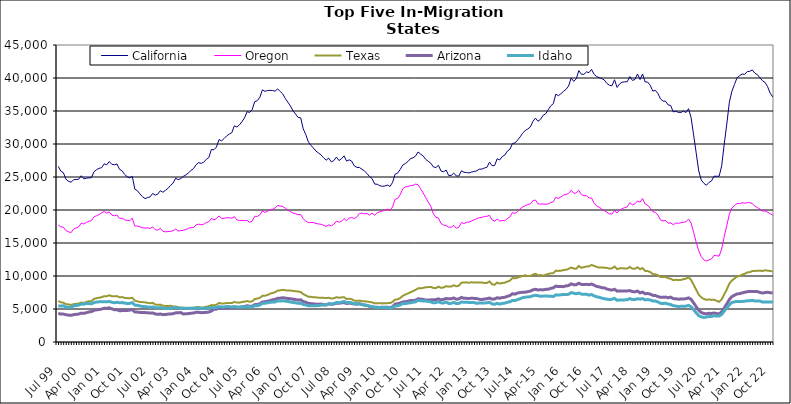
| Category | California | Oregon | Texas | Arizona | Idaho |
|---|---|---|---|---|---|
| Jul 99 | 26605 | 17749 | 6209 | 4339 | 5471 |
| Aug 99 | 25882 | 17447 | 6022 | 4228 | 5444 |
| Sep 99 | 25644 | 17401 | 5941 | 4237 | 5488 |
| Oct 99 | 24669 | 16875 | 5751 | 4134 | 5279 |
| Nov 99 | 24353 | 16701 | 5680 | 4073 | 5260 |
| Dec 99 | 24218 | 16570 | 5619 | 4042 | 5269 |
| Jan 00 | 24574 | 17109 | 5736 | 4142 | 5485 |
| Feb 00 | 24620 | 17295 | 5789 | 4192 | 5530 |
| Mar 00 | 24655 | 17436 | 5826 | 4226 | 5590 |
| Apr 00 | 25195 | 18009 | 5980 | 4375 | 5748 |
| May 00 | 24730 | 17875 | 5897 | 4337 | 5729 |
| Jun 00 | 24825 | 18113 | 6070 | 4444 | 5853 |
| Jul 00 | 24857 | 18294 | 6163 | 4555 | 5824 |
| Aug 00 | 24913 | 18376 | 6199 | 4603 | 5788 |
| Sep 00 | 25792 | 18971 | 6529 | 4804 | 5976 |
| Oct 00 | 26106 | 19135 | 6643 | 4870 | 6058 |
| Nov 00 | 26315 | 19306 | 6705 | 4926 | 6085 |
| Dec 00 | 26415 | 19570 | 6793 | 4991 | 6096 |
| Jan 01 | 26995 | 19781 | 6942 | 5122 | 6119 |
| Feb 01 | 26851 | 19519 | 6948 | 5089 | 6090 |
| Mar 01 | 27352 | 19720 | 7080 | 5180 | 6143 |
| Apr 01 | 26918 | 19221 | 6943 | 5020 | 6020 |
| May 01 | 26848 | 19126 | 6924 | 4899 | 5950 |
| Jun 01 | 26974 | 19241 | 6959 | 4895 | 6019 |
| Jul 01 | 26172 | 18725 | 6778 | 4737 | 5951 |
| Aug 01 | 25943 | 18736 | 6810 | 4757 | 5973 |
| Sep 01 | 25399 | 18514 | 6688 | 4753 | 5895 |
| Oct 01 | 25050 | 18415 | 6650 | 4780 | 5833 |
| Nov 01 | 24873 | 18381 | 6631 | 4826 | 5850 |
| Dec 01 | 25099 | 18765 | 6708 | 4898 | 5969 |
| Jan 02 | 23158 | 17561 | 6261 | 4560 | 5595 |
| Feb 02 | 22926 | 17573 | 6162 | 4531 | 5560 |
| Mar 02 | 22433 | 17452 | 6052 | 4481 | 5458 |
| Apr 02 | 22012 | 17314 | 6046 | 4458 | 5380 |
| May 02 | 21733 | 17267 | 6007 | 4452 | 5358 |
| Jun 02 | 21876 | 17298 | 5933 | 4444 | 5315 |
| Jul 02 | 21997 | 17209 | 5873 | 4383 | 5243 |
| Aug 02 | 22507 | 17436 | 5929 | 4407 | 5315 |
| Sep 02 | 22244 | 17010 | 5672 | 4248 | 5192 |
| Oct 02 | 22406 | 16952 | 5625 | 4191 | 5167 |
| Nov 02 | 22922 | 17223 | 5663 | 4242 | 5221 |
| Dec 02 | 22693 | 16770 | 5499 | 4142 | 5120 |
| Jan 03 | 22964 | 16694 | 5463 | 4166 | 5089 |
| Feb 03 | 23276 | 16727 | 5461 | 4226 | 5077 |
| Mar 03 | 23736 | 16766 | 5486 | 4251 | 5145 |
| Apr 03 | 24079 | 16859 | 5389 | 4289 | 5145 |
| May 03 | 24821 | 17117 | 5378 | 4415 | 5254 |
| Jun 03 | 24592 | 16812 | 5273 | 4426 | 5135 |
| Jul 03 | 24754 | 16875 | 5226 | 4466 | 5124 |
| Aug 03 | 25092 | 16922 | 5181 | 4244 | 5100 |
| Sep 03 | 25316 | 17036 | 5181 | 4279 | 5086 |
| Oct 03 | 25622 | 17228 | 5139 | 4301 | 5110 |
| Nov 03 | 25984 | 17335 | 5175 | 4362 | 5091 |
| Dec 03 | 26269 | 17350 | 5189 | 4396 | 5113 |
| Jan 04 | 26852 | 17734 | 5255 | 4492 | 5152 |
| Feb 04 | 27184 | 17860 | 5301 | 4502 | 5183 |
| Mar 04 | 27062 | 17757 | 5227 | 4443 | 5056 |
| Apr 04 | 27238 | 17840 | 5227 | 4461 | 5104 |
| May 04 | 27671 | 18113 | 5345 | 4493 | 5095 |
| Jun 04 | 27949 | 18201 | 5416 | 4532 | 5103 |
| Jul 04 | 29172 | 18727 | 5597 | 4697 | 5231 |
| Aug 04 | 29122 | 18529 | 5561 | 4945 | 5197 |
| Sep 04 | 29542 | 18678 | 5656 | 4976 | 5237 |
| Oct 04 | 30674 | 19108 | 5922 | 5188 | 5363 |
| Nov 04 | 30472 | 18716 | 5823 | 5106 | 5321 |
| Dec 04 | 30831 | 18755 | 5838 | 5135 | 5312 |
| Jan 05 | 31224 | 18823 | 5906 | 5155 | 5374 |
| Feb 05 | 31495 | 18842 | 5898 | 5168 | 5357 |
| Mar 05 | 31714 | 18738 | 5894 | 5212 | 5313 |
| Apr 05 | 32750 | 18998 | 6060 | 5340 | 5350 |
| May 05 | 32575 | 18504 | 5989 | 5269 | 5276 |
| Jun 05 | 32898 | 18414 | 5954 | 5252 | 5271 |
| Jul 05 | 33384 | 18395 | 6062 | 5322 | 5322 |
| Aug 05 | 33964 | 18381 | 6113 | 5375 | 5316 |
| Sep 05 | 34897 | 18426 | 6206 | 5493 | 5362 |
| Oct 05 | 34780 | 18132 | 6100 | 5408 | 5308 |
| Nov 05 | 35223 | 18332 | 6162 | 5434 | 5314 |
| Dec 05 | 36415 | 19047 | 6508 | 5658 | 5487 |
| Jan 06 | 36567 | 19032 | 6576 | 5688 | 5480 |
| Feb 06 | 37074 | 19257 | 6692 | 5792 | 5616 |
| Mar 06 | 38207 | 19845 | 6993 | 6052 | 5850 |
| Apr 06 | 37976 | 19637 | 7024 | 6101 | 5864 |
| May 06 | 38099 | 19781 | 7114 | 6178 | 5943 |
| Jun 06 | 38141 | 20061 | 7331 | 6276 | 6018 |
| Jul 06 | 38097 | 20111 | 7431 | 6399 | 6046 |
| Aug 06 | 38021 | 20333 | 7542 | 6450 | 6064 |
| Sep 06 | 38349 | 20686 | 7798 | 6627 | 6232 |
| Oct 06 | 37947 | 20591 | 7825 | 6647 | 6216 |
| Nov 06 | 37565 | 20526 | 7907 | 6707 | 6244 |
| Dec 06 | 36884 | 20272 | 7840 | 6648 | 6192 |
| Jan 07 | 36321 | 19984 | 7789 | 6597 | 6151 |
| Feb 07 | 35752 | 19752 | 7799 | 6554 | 6048 |
| Mar 07 | 35025 | 19547 | 7737 | 6487 | 5989 |
| Apr 07 | 34534 | 19412 | 7685 | 6430 | 5937 |
| May 07 | 34022 | 19296 | 7654 | 6353 | 5858 |
| Jun 07 | 33974 | 19318 | 7577 | 6390 | 5886 |
| Jul 07 | 32298 | 18677 | 7250 | 6117 | 5682 |
| Aug 07 | 31436 | 18322 | 7070 | 6034 | 5617 |
| Sep 07 | 30331 | 18087 | 6853 | 5847 | 5500 |
| Oct 07 | 29813 | 18108 | 6839 | 5821 | 5489 |
| Nov 07 | 29384 | 18105 | 6777 | 5769 | 5481 |
| Dec 07 | 28923 | 17949 | 6760 | 5733 | 5499 |
| Jan 08 | 28627 | 17890 | 6721 | 5732 | 5521 |
| Feb 08 | 28328 | 17834 | 6719 | 5749 | 5579 |
| Mar 08 | 27911 | 17680 | 6690 | 5650 | 5614 |
| Apr 08 | 27543 | 17512 | 6656 | 5612 | 5635 |
| May 08 | 27856 | 17754 | 6705 | 5774 | 5798 |
| Jun 08 | 27287 | 17589 | 6593 | 5717 | 5745 |
| Jul 08 | 27495 | 17834 | 6623 | 5761 | 5807 |
| Aug 08 | 28018 | 18309 | 6789 | 5867 | 5982 |
| Sep-08 | 27491 | 18164 | 6708 | 5864 | 5954 |
| Oct 08 | 27771 | 18291 | 6755 | 5942 | 6032 |
| Nov 08 | 28206 | 18706 | 6787 | 5970 | 6150 |
| Dec 08 | 27408 | 18353 | 6505 | 5832 | 5975 |
| Jan 09 | 27601 | 18778 | 6569 | 5890 | 5995 |
| Feb 09 | 27394 | 18863 | 6483 | 5845 | 5936 |
| Mar 09 | 26690 | 18694 | 6273 | 5751 | 5806 |
| Apr 09 | 26461 | 18943 | 6222 | 5735 | 5777 |
| May 09 | 26435 | 19470 | 6272 | 5819 | 5767 |
| Jun 09 | 26187 | 19522 | 6199 | 5700 | 5649 |
| Jul 09 | 25906 | 19408 | 6171 | 5603 | 5617 |
| Aug 09 | 25525 | 19469 | 6128 | 5533 | 5540 |
| Sep 09 | 25050 | 19249 | 6059 | 5405 | 5437 |
| Oct 09 | 24741 | 19529 | 6004 | 5349 | 5369 |
| Nov 09 | 23928 | 19187 | 5854 | 5271 | 5248 |
| Dec 09 | 23899 | 19607 | 5886 | 5261 | 5195 |
| Jan 10 | 23676 | 19703 | 5881 | 5232 | 5234 |
| Feb 10 | 23592 | 19845 | 5850 | 5272 | 5236 |
| Mar 10 | 23634 | 19946 | 5864 | 5278 | 5219 |
| Apr 10 | 23774 | 20134 | 5889 | 5257 | 5201 |
| May 10 | 23567 | 19966 | 5897 | 5172 | 5105 |
| Jun 10 | 24166 | 20464 | 6087 | 5356 | 5237 |
| Jul 10 | 25410 | 21627 | 6417 | 5742 | 5452 |
| Aug 10 | 25586 | 21744 | 6465 | 5797 | 5491 |
| Sep 10 | 26150 | 22314 | 6667 | 5907 | 5609 |
| Oct 10 | 26807 | 23219 | 6986 | 6070 | 5831 |
| Nov 10 | 27033 | 23520 | 7179 | 6100 | 5810 |
| Dec 10 | 27332 | 23551 | 7361 | 6182 | 5898 |
| Jan 11 | 27769 | 23697 | 7525 | 6276 | 5938 |
| Feb 11 | 27898 | 23718 | 7708 | 6267 | 6016 |
| Mar 11 | 28155 | 23921 | 7890 | 6330 | 6081 |
| Apr 11 | 28790 | 23847 | 8146 | 6544 | 6305 |
| May 11 | 28471 | 23215 | 8131 | 6502 | 6248 |
| Jun 11 | 28191 | 22580 | 8199 | 6445 | 6217 |
| Jul 11 | 27678 | 21867 | 8291 | 6368 | 6202 |
| Aug 11 | 27372 | 21203 | 8321 | 6356 | 6146 |
| Sep 11 | 27082 | 20570 | 8341 | 6387 | 6075 |
| Oct 11 | 26528 | 19442 | 8191 | 6402 | 5932 |
| Nov 11 | 26440 | 18872 | 8176 | 6426 | 5968 |
| Dec 11 | 26770 | 18784 | 8401 | 6533 | 6106 |
| Jan 12 | 25901 | 17963 | 8202 | 6390 | 5933 |
| Feb 12 | 25796 | 17718 | 8266 | 6456 | 5900 |
| Mar 12 | 26042 | 17647 | 8456 | 6600 | 6054 |
| Apr 12 | 25239 | 17386 | 8388 | 6534 | 5838 |
| May 12 | 25238 | 17407 | 8401 | 6558 | 5854 |
| Jun 12 | 25593 | 17673 | 8594 | 6669 | 6009 |
| Jul 12 | 25155 | 17237 | 8432 | 6474 | 5817 |
| Aug 12 | 25146 | 17391 | 8536 | 6539 | 5842 |
| Sep 12 | 25942 | 18102 | 8989 | 6759 | 6061 |
| Oct 12 | 25718 | 17953 | 9012 | 6618 | 6027 |
| Nov 12 | 25677 | 18134 | 9032 | 6611 | 6009 |
| Dec 12 | 25619 | 18166 | 8981 | 6601 | 5999 |
| Jan 13 | 25757 | 18344 | 9051 | 6627 | 5989 |
| Feb-13 | 25830 | 18512 | 9001 | 6606 | 5968 |
| Mar-13 | 25940 | 18689 | 9021 | 6577 | 5853 |
| Apr 13 | 26187 | 18844 | 9013 | 6478 | 5925 |
| May 13 | 26192 | 18884 | 9003 | 6431 | 5924 |
| Jun-13 | 26362 | 19013 | 8948 | 6508 | 5896 |
| Jul 13 | 26467 | 19037 | 8958 | 6559 | 5948 |
| Aug 13 | 27253 | 19198 | 9174 | 6655 | 6020 |
| Sep 13 | 26711 | 18501 | 8747 | 6489 | 5775 |
| Oct 13 | 26733 | 18301 | 8681 | 6511 | 5711 |
| Nov 13 | 27767 | 18620 | 8989 | 6709 | 5860 |
| Dec 13 | 27583 | 18320 | 8863 | 6637 | 5740 |
| Jan 14 | 28107 | 18409 | 8939 | 6735 | 5843 |
| Feb-14 | 28313 | 18383 | 8989 | 6779 | 5893 |
| Mar 14 | 28934 | 18696 | 9160 | 6918 | 6015 |
| Apr 14 | 29192 | 18946 | 9291 | 7036 | 6099 |
| May 14 | 30069 | 19603 | 9701 | 7314 | 6304 |
| Jun 14 | 30163 | 19487 | 9641 | 7252 | 6293 |
| Jul-14 | 30587 | 19754 | 9752 | 7415 | 6427 |
| Aug-14 | 31074 | 20201 | 9882 | 7499 | 6557 |
| Sep 14 | 31656 | 20459 | 9997 | 7536 | 6719 |
| Oct 14 | 32037 | 20663 | 10109 | 7555 | 6786 |
| Nov 14 | 32278 | 20825 | 9992 | 7628 | 6831 |
| Dec 14 | 32578 | 20918 | 10006 | 7705 | 6860 |
| Jan 15 | 33414 | 21396 | 10213 | 7906 | 7000 |
| Feb 15 | 33922 | 21518 | 10337 | 7982 | 7083 |
| Mar 15 | 33447 | 20942 | 10122 | 7891 | 7006 |
| Apr-15 | 33731 | 20893 | 10138 | 7906 | 6931 |
| May 15 | 34343 | 20902 | 10053 | 7895 | 6952 |
| Jun-15 | 34572 | 20870 | 10192 | 7973 | 6966 |
| Jul 15 | 35185 | 20916 | 10303 | 8000 | 6949 |
| Aug 15 | 35780 | 21115 | 10399 | 8126 | 6938 |
| Sep 15 | 36109 | 21246 | 10428 | 8207 | 6896 |
| Oct 15 | 37555 | 21908 | 10813 | 8477 | 7140 |
| Nov 15 | 37319 | 21750 | 10763 | 8390 | 7112 |
| Dec 15 | 37624 | 21990 | 10807 | 8395 | 7149 |
| Jan 16 | 37978 | 22248 | 10892 | 8388 | 7201 |
| Feb 16 | 38285 | 22369 | 10951 | 8508 | 7192 |
| Mar 16 | 38792 | 22506 | 11075 | 8547 | 7226 |
| Apr 16 | 39994 | 22999 | 11286 | 8815 | 7487 |
| May 16 | 39488 | 22548 | 11132 | 8673 | 7382 |
| Jun 16 | 39864 | 22556 | 11100 | 8682 | 7315 |
| Jul 16 | 41123 | 22989 | 11516 | 8903 | 7420 |
| Aug 16 | 40573 | 22333 | 11251 | 8731 | 7261 |
| Sep 16 | 40560 | 22162 | 11340 | 8692 | 7216 |
| Oct 16 | 40923 | 22172 | 11456 | 8742 | 7233 |
| Nov 16 | 40817 | 21818 | 11459 | 8685 | 7101 |
| Dec 16 | 41311 | 21815 | 11681 | 8783 | 7203 |
| Jan 17 | 40543 | 21029 | 11524 | 8609 | 6982 |
| Feb 17 | 40218 | 20613 | 11385 | 8416 | 6852 |
| Mar 17 | 40052 | 20425 | 11276 | 8354 | 6775 |
| Apr 17 | 39913 | 20147 | 11297 | 8218 | 6653 |
| May 17 | 39695 | 19910 | 11265 | 8196 | 6552 |
| Jun 17 | 39177 | 19650 | 11225 | 8034 | 6500 |
| Jul 17 | 38901 | 19419 | 11115 | 7923 | 6429 |
| Aug 17 | 38827 | 19389 | 11168 | 7867 | 6479 |
| Sep 17 | 39736 | 19936 | 11426 | 7991 | 6609 |
| Oct 17 | 38576 | 19547 | 11041 | 7708 | 6315 |
| Nov 17 | 39108 | 20013 | 11158 | 7746 | 6381 |
| Dec 17 | 39359 | 20202 | 11185 | 7743 | 6366 |
| Jan 18 | 39420 | 20362 | 11118 | 7736 | 6380 |
| Feb 18 | 39440 | 20476 | 11128 | 7741 | 6407 |
| Mar 18 | 40218 | 21106 | 11362 | 7789 | 6578 |
| Apr 18 | 39637 | 20788 | 11111 | 7642 | 6423 |
| May 18 | 39777 | 20933 | 11097 | 7591 | 6430 |
| Jun 18 | 40602 | 21381 | 11317 | 7721 | 6554 |
| Jul 18 | 39767 | 21189 | 11038 | 7445 | 6489 |
| Aug 18 | 40608 | 21729 | 11200 | 7560 | 6569 |
| Sep 18 | 39395 | 20916 | 10772 | 7318 | 6383 |
| Oct 18 | 39383 | 20724 | 10740 | 7344 | 6429 |
| Nov 18 | 38891 | 20265 | 10605 | 7255 | 6365 |
| Dec 18 | 38013 | 19741 | 10292 | 7069 | 6205 |
| Jan 19 | 38130 | 19643 | 10261 | 7032 | 6203 |
| Feb 19 | 37658 | 19237 | 10132 | 6892 | 6073 |
| Mar 19 | 36831 | 18492 | 9848 | 6766 | 5863 |
| Apr 19 | 36492 | 18349 | 9839 | 6763 | 5827 |
| May 19 | 36481 | 18407 | 9867 | 6809 | 5873 |
| Jun 19 | 35925 | 17998 | 9661 | 6698 | 5761 |
| Jul 19 | 35843 | 18049 | 9598 | 6800 | 5673 |
| Aug 19 | 34870 | 17785 | 9361 | 6577 | 5512 |
| Sep 19 | 34945 | 18038 | 9428 | 6547 | 5437 |
| Oct 19 | 34802 | 17977 | 9385 | 6483 | 5390 |
| Nov 19 | 34775 | 18072 | 9403 | 6511 | 5401 |
| Dec 19 | 34976 | 18140 | 9518 | 6521 | 5419 |
| Jan 20 | 34774 | 18209 | 9594 | 6561 | 5434 |
| Feb 20 | 35352 | 18632 | 9804 | 6682 | 5543 |
| Mar 20 | 34013 | 18041 | 9411 | 6464 | 5330 |
| Apr 20 | 31385 | 16629 | 8666 | 5922 | 4906 |
| May 20 | 28657 | 15123 | 7927 | 5355 | 4419 |
| Jun 20 | 25915 | 13817 | 7164 | 4815 | 3992 |
| Jul 20 | 24545 | 12926 | 6776 | 4457 | 3810 |
| Aug 20 | 24048 | 12443 | 6521 | 4326 | 3720 |
| Sep 20 | 23756 | 12258 | 6386 | 4266 | 3784 |
| Oct 20 | 24166 | 12429 | 6452 | 4347 | 3861 |
| Nov 20 | 24404 | 12597 | 6386 | 4324 | 3883 |
| Dec 20 | 25120 | 13122 | 6420 | 4394 | 3974 |
| Jan 21 | 25111 | 13080 | 6236 | 4304 | 3924 |
| Feb 21 | 25114 | 13015 | 6094 | 4260 | 3930 |
| Mar 21 | 26701 | 14096 | 6455 | 4567 | 4185 |
| Apr 21 | 29998 | 15978 | 7222 | 5164 | 4697 |
| May 21 | 33020 | 17641 | 7969 | 5748 | 5148 |
| Jun 21 | 36320 | 19369 | 8840 | 6450 | 5628 |
| Jul 21 | 37989 | 20320 | 9306 | 6877 | 5984 |
| Aug 21 | 39007 | 20657 | 9615 | 7094 | 6084 |
| Sep 21 | 40023 | 20974 | 9914 | 7277 | 6151 |
| Oct 21 | 40348 | 20966 | 10003 | 7327 | 6140 |
| Nov 21 | 40599 | 21096 | 10203 | 7437 | 6136 |
| Dec 21 | 40548 | 21032 | 10328 | 7532 | 6183 |
| Jan 22 | 40967 | 21106 | 10535 | 7618 | 6237 |
| Feb 22 | 41019 | 21125 | 10579 | 7673 | 6236 |
| Mar 22 | 41220 | 20949 | 10751 | 7660 | 6310 |
| Apr 22 | 40730 | 20602 | 10772 | 7661 | 6221 |
| May 22 | 40504 | 20370 | 10792 | 7636 | 6210 |
| Jun 22 | 40013 | 20127 | 10802 | 7504 | 6199 |
| Jul 22 | 39582 | 19846 | 10761 | 7419 | 6050 |
| Aug 22 | 39321 | 19865 | 10868 | 7487 | 6071 |
| Sep 22 | 38685 | 19666 | 10811 | 7536 | 6074 |
| Oct 22 | 37700 | 19450 | 10764 | 7469 | 6042 |
| Nov 22 | 37133 | 19198 | 10701 | 7425 | 6042 |